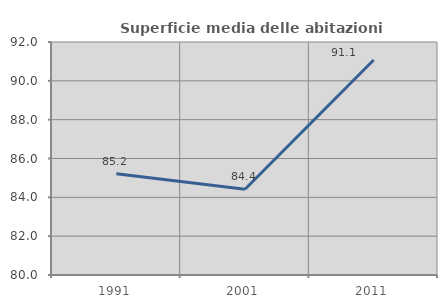
| Category | Superficie media delle abitazioni occupate |
|---|---|
| 1991.0 | 85.216 |
| 2001.0 | 84.415 |
| 2011.0 | 91.072 |